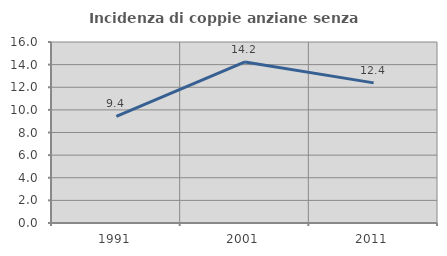
| Category | Incidenza di coppie anziane senza figli  |
|---|---|
| 1991.0 | 9.42 |
| 2001.0 | 14.239 |
| 2011.0 | 12.386 |